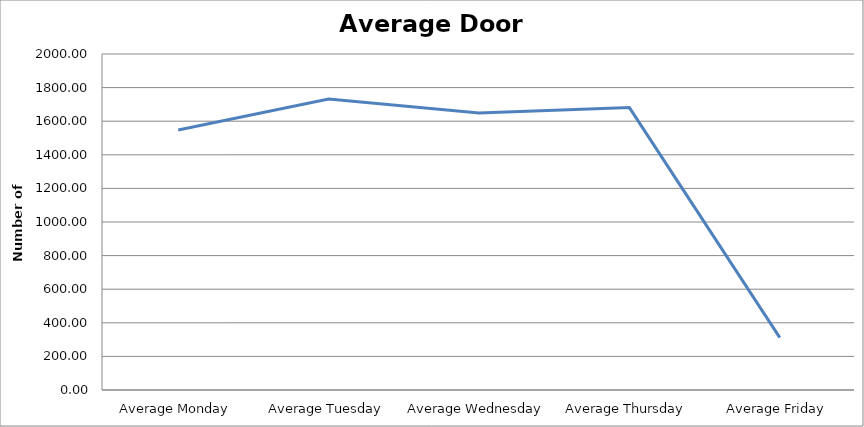
| Category | Series 0 |
|---|---|
| Average Monday | 1547.5 |
| Average Tuesday | 1732.25 |
| Average Wednesday | 1649.5 |
| Average Thursday | 1681 |
| Average Friday | 312 |